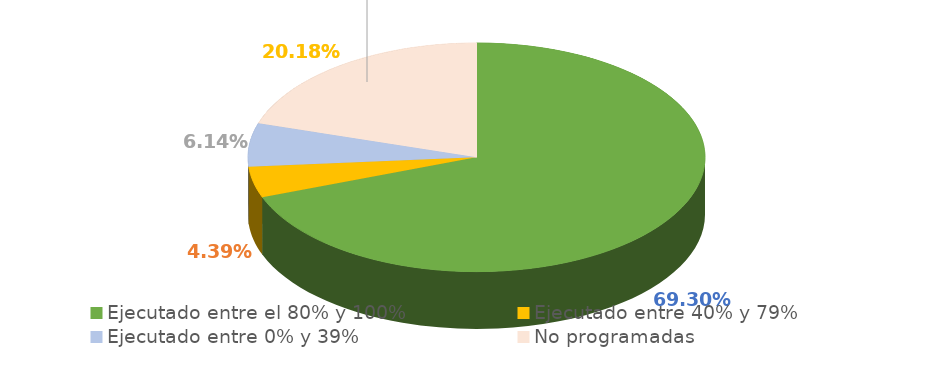
| Category | Series 0 |
|---|---|
| Ejecutado entre el 80% y 100% | 0.693 |
| Ejecutado entre 40% y 79% | 0.044 |
| Ejecutado entre 0% y 39% | 0.061 |
| No programadas | 0.202 |